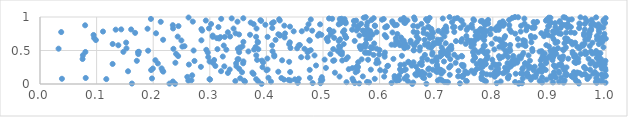
| Category | Series 0 |
|---|---|
| 0.6577083570650133 | 0.001 |
| 0.39151467776081844 | 0.002 |
| 0.2386600297569495 | 0.003 |
| 0.6826755683995668 | 0.004 |
| 0.8457954785515889 | 0.005 |
| 0.2287082657441678 | 0.006 |
| 0.16236882179334797 | 0.007 |
| 0.9519847769633453 | 0.008 |
| 0.5640135943199389 | 0.009 |
| 0.7418731885043104 | 0.01 |
| 0.851582818926593 | 0.011 |
| 0.49557412353310665 | 0.012 |
| 0.8068430579411486 | 0.013 |
| 0.48177118131768154 | 0.014 |
| 0.5561145821895631 | 0.015 |
| 0.8469149293773862 | 0.016 |
| 0.6211795006071772 | 0.017 |
| 0.45537482640513244 | 0.018 |
| 0.9836680588862309 | 0.019 |
| 0.9990413690955496 | 0.02 |
| 0.9251124557077337 | 0.021 |
| 0.6593749245634024 | 0.022 |
| 0.8871500666999539 | 0.023 |
| 0.9063073288141514 | 0.024 |
| 0.5813916187208675 | 0.025 |
| 0.7207976505275142 | 0.026 |
| 0.5415255045620846 | 0.027 |
| 0.7177577805560684 | 0.028 |
| 0.7145636042582806 | 0.029 |
| 0.8394922497313358 | 0.03 |
| 0.5778385505120144 | 0.031 |
| 0.9820733071431067 | 0.032 |
| 0.9508096456711917 | 0.033 |
| 0.9171239651383337 | 0.034 |
| 0.40808122585249396 | 0.035 |
| 0.36213586674434134 | 0.036 |
| 0.23477400931054074 | 0.037 |
| 0.8139451524758927 | 0.038 |
| 0.99214532719401 | 0.039 |
| 0.7879166648753583 | 0.04 |
| 0.7539526571633247 | 0.041 |
| 0.3853332377712915 | 0.042 |
| 0.6500414312973579 | 0.043 |
| 0.3451083058914506 | 0.044 |
| 0.7529277406694985 | 0.045 |
| 0.8828807820984435 | 0.046 |
| 0.9471541554460889 | 0.047 |
| 0.5537045803441951 | 0.048 |
| 0.3605155978847313 | 0.049 |
| 0.6299598114713447 | 0.05 |
| 0.2620503791006398 | 0.051 |
| 0.4424128741288158 | 0.052 |
| 0.7028731180280472 | 0.053 |
| 0.9268930805293935 | 0.054 |
| 0.2675133716113726 | 0.055 |
| 0.7845113333371354 | 0.056 |
| 0.7099797373108472 | 0.057 |
| 0.9856078460612595 | 0.058 |
| 0.6342726890529243 | 0.059 |
| 0.49871676101204027 | 0.06 |
| 0.4391982772350297 | 0.061 |
| 0.6331198841666579 | 0.062 |
| 0.629316671268603 | 0.063 |
| 0.8672964560582284 | 0.064 |
| 0.8947409637129079 | 0.065 |
| 0.4309683726538662 | 0.066 |
| 0.3004179498074734 | 0.067 |
| 0.49615164181225024 | 0.068 |
| 0.450201690080805 | 0.069 |
| 0.7063517004028819 | 0.07 |
| 0.29949672971371233 | 0.071 |
| 0.3819771204199189 | 0.072 |
| 0.11713722328268089 | 0.073 |
| 0.7802210960102282 | 0.074 |
| 0.9671966619125858 | 0.075 |
| 0.9453440984648958 | 0.076 |
| 0.5914186856058925 | 0.077 |
| 0.038750803568163746 | 0.078 |
| 0.4571645260793978 | 0.079 |
| 0.5520246286552065 | 0.08 |
| 0.6438503347835421 | 0.081 |
| 0.8529392517900825 | 0.082 |
| 0.19782915792301503 | 0.083 |
| 0.8270746624480898 | 0.084 |
| 0.3536465315941008 | 0.085 |
| 0.6267763652676756 | 0.086 |
| 0.9828803999318404 | 0.087 |
| 0.6787240509189165 | 0.088 |
| 0.4265040333867852 | 0.089 |
| 0.08074794796422166 | 0.09 |
| 0.47696343134294916 | 0.091 |
| 0.9026921890047329 | 0.092 |
| 0.40362800577840163 | 0.093 |
| 0.9940838118747835 | 0.094 |
| 0.9210412176052543 | 0.095 |
| 0.9114651714350256 | 0.096 |
| 0.6764509740033988 | 0.097 |
| 0.8670532464429793 | 0.098 |
| 0.8871264021701253 | 0.099 |
| 0.8265549469152792 | 0.1 |
| 0.9413291809039275 | 0.101 |
| 0.4979314990121132 | 0.102 |
| 0.779911292746229 | 0.103 |
| 0.7467088794043432 | 0.104 |
| 0.875580064573624 | 0.105 |
| 0.2602449129069175 | 0.106 |
| 0.8716659403634651 | 0.107 |
| 0.9705986389567803 | 0.108 |
| 0.8034270642867731 | 0.109 |
| 0.6081045898464867 | 0.11 |
| 0.5292177158869973 | 0.111 |
| 0.8610667700994865 | 0.112 |
| 0.570317939156256 | 0.113 |
| 0.7387538771129664 | 0.114 |
| 0.9022847526282444 | 0.115 |
| 0.9056533569579188 | 0.116 |
| 0.6481718450617242 | 0.117 |
| 0.6264341926432238 | 0.118 |
| 0.7457370913616966 | 0.119 |
| 0.9996772720182017 | 0.12 |
| 0.996066622944285 | 0.121 |
| 0.9381952996641326 | 0.122 |
| 0.6343679803991165 | 0.123 |
| 0.8287116963704869 | 0.124 |
| 0.862253362029271 | 0.125 |
| 0.9446554311487617 | 0.126 |
| 0.8018425254106775 | 0.127 |
| 0.9297263246317929 | 0.128 |
| 0.6649322240941544 | 0.129 |
| 0.2688804544058041 | 0.13 |
| 0.9448766851282245 | 0.131 |
| 0.6882368887264289 | 0.132 |
| 0.9083437074204997 | 0.133 |
| 0.7485366730861572 | 0.134 |
| 0.9988198791160979 | 0.135 |
| 0.9644971259915626 | 0.136 |
| 0.7240018832920028 | 0.137 |
| 0.9571539463283238 | 0.138 |
| 0.7958533742195025 | 0.139 |
| 0.9852380578382361 | 0.14 |
| 0.6709536948089148 | 0.141 |
| 0.9278910818003356 | 0.142 |
| 0.9927357561898761 | 0.143 |
| 0.7892229739080111 | 0.144 |
| 0.8768610138235257 | 0.145 |
| 0.8075341251197174 | 0.146 |
| 0.6631028219377458 | 0.147 |
| 0.9621686587761049 | 0.148 |
| 0.8537143946168744 | 0.149 |
| 0.37730937096602263 | 0.15 |
| 0.860864597074778 | 0.151 |
| 0.9302127186527567 | 0.152 |
| 0.8405176896992061 | 0.153 |
| 0.7091751916923033 | 0.154 |
| 0.9774301431193226 | 0.155 |
| 0.6796928206342037 | 0.156 |
| 0.8496831812067541 | 0.157 |
| 0.781124782894523 | 0.158 |
| 0.6682763406079744 | 0.159 |
| 0.8182019560814636 | 0.16 |
| 0.7670253694755241 | 0.161 |
| 0.7557072146852332 | 0.162 |
| 0.9531790667965273 | 0.163 |
| 0.8605066511310083 | 0.164 |
| 0.33198963868101594 | 0.165 |
| 0.8032189778827185 | 0.166 |
| 0.917103021457982 | 0.167 |
| 0.7822130642946176 | 0.168 |
| 0.5210201312495519 | 0.169 |
| 0.37523900902222235 | 0.17 |
| 0.810483099812357 | 0.171 |
| 0.9492616207428103 | 0.172 |
| 0.9079899631916202 | 0.173 |
| 0.8211517705831013 | 0.174 |
| 0.5578245417096903 | 0.175 |
| 0.3569269350495314 | 0.176 |
| 0.9433454175202712 | 0.177 |
| 0.9803961997911148 | 0.178 |
| 0.44199627455591234 | 0.179 |
| 0.6750683892978181 | 0.18 |
| 0.7020107063718685 | 0.181 |
| 0.8864604385064213 | 0.182 |
| 0.42099164037477577 | 0.183 |
| 0.7003331056945983 | 0.184 |
| 0.2177730329665049 | 0.185 |
| 0.6380112134499992 | 0.186 |
| 0.7126390002892306 | 0.187 |
| 0.9163060695911915 | 0.188 |
| 0.7513895203198006 | 0.189 |
| 0.15554190842411894 | 0.19 |
| 0.3198950565389479 | 0.191 |
| 0.6098231141423897 | 0.192 |
| 0.8806761102341628 | 0.193 |
| 0.7682967042965304 | 0.194 |
| 0.5608866731293695 | 0.195 |
| 0.739320295229317 | 0.196 |
| 0.8254001345980083 | 0.197 |
| 0.8052849920723678 | 0.198 |
| 0.7625812123798018 | 0.199 |
| 0.9269635671594636 | 0.2 |
| 0.2164493206824381 | 0.201 |
| 0.6678813140025208 | 0.202 |
| 0.8721599751680055 | 0.203 |
| 0.999058729952582 | 0.204 |
| 0.400158379810809 | 0.205 |
| 0.6010901947703361 | 0.206 |
| 0.6436460375917337 | 0.207 |
| 0.19634892737915602 | 0.208 |
| 0.8935471744197215 | 0.209 |
| 0.7084628026256693 | 0.21 |
| 0.4765556149039468 | 0.211 |
| 0.971958984966481 | 0.212 |
| 0.6937741656090826 | 0.213 |
| 0.5845388667546938 | 0.214 |
| 0.40213412681484595 | 0.215 |
| 0.33513317331080006 | 0.216 |
| 0.6462055282701445 | 0.217 |
| 0.8839846350835572 | 0.218 |
| 0.7016019881656144 | 0.219 |
| 0.6360125318696939 | 0.22 |
| 0.5455304864016943 | 0.221 |
| 0.6860523502665048 | 0.222 |
| 0.7048070501618386 | 0.223 |
| 0.8522018341928514 | 0.224 |
| 0.771760104609657 | 0.225 |
| 0.35193806447633225 | 0.226 |
| 0.8096054049515441 | 0.227 |
| 0.9641611233884227 | 0.228 |
| 0.9247100479744463 | 0.229 |
| 0.9925757030650876 | 0.23 |
| 0.19938320530953418 | 0.231 |
| 0.6872055346039667 | 0.232 |
| 0.21481902498539004 | 0.233 |
| 0.8638205016694955 | 0.234 |
| 0.870497321401085 | 0.235 |
| 0.9985737729001587 | 0.236 |
| 0.778044732452363 | 0.237 |
| 0.5521045853131289 | 0.238 |
| 0.8274155536697186 | 0.239 |
| 0.5051417711157264 | 0.24 |
| 0.8891315899760304 | 0.241 |
| 0.8536729215651855 | 0.242 |
| 0.9618685574114456 | 0.243 |
| 0.5590121967509705 | 0.244 |
| 0.8216339701234112 | 0.245 |
| 0.7228292085825004 | 0.246 |
| 0.797077968444053 | 0.247 |
| 0.9303365081317416 | 0.248 |
| 0.9108782712665285 | 0.249 |
| 0.5592179381782425 | 0.25 |
| 0.3931351790782917 | 0.251 |
| 0.561900384020947 | 0.252 |
| 0.8662232659876546 | 0.253 |
| 0.9613381688082375 | 0.254 |
| 0.9941274407689255 | 0.255 |
| 0.28427363931467636 | 0.256 |
| 0.7820976186028381 | 0.257 |
| 0.8740571310046206 | 0.258 |
| 0.7479462441108682 | 0.259 |
| 0.6644511412108369 | 0.26 |
| 0.9935428409897687 | 0.261 |
| 0.8317788688700818 | 0.262 |
| 0.3256396720603582 | 0.263 |
| 0.5605367716208516 | 0.264 |
| 0.34701077591266927 | 0.265 |
| 0.6136721717623402 | 0.266 |
| 0.92237459635686 | 0.267 |
| 0.701024389892262 | 0.268 |
| 0.30986932252999383 | 0.269 |
| 0.8866599499655753 | 0.27 |
| 0.9814294766682679 | 0.271 |
| 0.6148510940494463 | 0.272 |
| 0.7255995427913391 | 0.273 |
| 0.656801884654705 | 0.274 |
| 0.8622198027536484 | 0.275 |
| 0.48771492198606353 | 0.276 |
| 0.981541578685113 | 0.277 |
| 0.805466507598583 | 0.278 |
| 0.9077929811588973 | 0.279 |
| 0.748249578941867 | 0.28 |
| 0.8329934080863436 | 0.281 |
| 0.9163102374506291 | 0.282 |
| 0.8850551083175209 | 0.283 |
| 0.6745417836742715 | 0.284 |
| 0.7451914407853223 | 0.285 |
| 0.6367026519544823 | 0.286 |
| 0.8048871308604165 | 0.287 |
| 0.7013580256882297 | 0.288 |
| 0.9876817395391402 | 0.289 |
| 0.26304034835884615 | 0.29 |
| 0.6436202595216646 | 0.291 |
| 0.8107381664936346 | 0.292 |
| 0.9816854307953297 | 0.293 |
| 0.7871927501100399 | 0.294 |
| 0.8606064684122119 | 0.295 |
| 0.997733148333387 | 0.296 |
| 0.7778066783295803 | 0.297 |
| 0.7715927085208075 | 0.298 |
| 0.1282771671416405 | 0.299 |
| 0.9202362290080235 | 0.3 |
| 0.7875107603162044 | 0.301 |
| 0.8380464894703011 | 0.302 |
| 0.8012150453112378 | 0.303 |
| 0.9725708453560146 | 0.304 |
| 0.6712166658030171 | 0.305 |
| 0.8572975585090574 | 0.306 |
| 0.2082269748284445 | 0.307 |
| 0.346500329155647 | 0.308 |
| 0.3588762721068494 | 0.309 |
| 0.8569648983089942 | 0.31 |
| 0.5941522422889491 | 0.311 |
| 0.8260001452947424 | 0.312 |
| 0.8941332498463119 | 0.313 |
| 0.9469095877458386 | 0.314 |
| 0.30558154740317817 | 0.315 |
| 0.734313569348736 | 0.316 |
| 0.23919019268158676 | 0.317 |
| 0.9906885313232675 | 0.318 |
| 0.8431684165319419 | 0.319 |
| 0.5979850775680257 | 0.32 |
| 0.39438712188341657 | 0.321 |
| 0.6518205388248193 | 0.322 |
| 0.9903456748847973 | 0.323 |
| 0.6598991103401529 | 0.324 |
| 0.5621632407152507 | 0.325 |
| 0.9442798677416717 | 0.326 |
| 0.9510863115379654 | 0.327 |
| 0.6744886401358228 | 0.328 |
| 0.9474831468341119 | 0.329 |
| 0.9755868640514735 | 0.33 |
| 0.4402254254099442 | 0.331 |
| 0.6506814891894314 | 0.332 |
| 0.7820359007906921 | 0.333 |
| 0.8936960398827158 | 0.334 |
| 0.29963467293347296 | 0.335 |
| 0.7136882458291163 | 0.336 |
| 0.3594034547516508 | 0.337 |
| 0.6929407922385831 | 0.338 |
| 0.8338393647637589 | 0.339 |
| 0.9879090969593701 | 0.34 |
| 0.8432101070315688 | 0.341 |
| 0.7007948449007674 | 0.342 |
| 0.7779437651047626 | 0.343 |
| 0.27291805594011775 | 0.344 |
| 0.9990531375427243 | 0.345 |
| 0.17107440142128974 | 0.346 |
| 0.517914770191076 | 0.347 |
| 0.8655827279948196 | 0.348 |
| 0.3921094291260162 | 0.349 |
| 0.7653347991378991 | 0.35 |
| 0.5340146945403729 | 0.351 |
| 0.8846016584351628 | 0.352 |
| 0.5199966098615573 | 0.353 |
| 0.42778180351321793 | 0.354 |
| 0.20385998265682675 | 0.355 |
| 0.9054953822954941 | 0.356 |
| 0.840599925334217 | 0.357 |
| 0.30765366687925794 | 0.358 |
| 0.5957031723982692 | 0.359 |
| 0.38356430415121207 | 0.36 |
| 0.787847637178864 | 0.361 |
| 0.579632729962697 | 0.362 |
| 0.798998337454484 | 0.363 |
| 0.5028832692537709 | 0.364 |
| 0.922479403927534 | 0.365 |
| 0.6842622554038007 | 0.366 |
| 0.8362136152234977 | 0.367 |
| 0.5683069880074592 | 0.368 |
| 0.3509672183547636 | 0.369 |
| 0.3490399243248381 | 0.37 |
| 0.5407892360308886 | 0.371 |
| 0.7248135976454921 | 0.372 |
| 0.07521415013177254 | 0.373 |
| 0.9910408486714962 | 0.374 |
| 0.6244080648920469 | 0.375 |
| 0.9692219924305884 | 0.376 |
| 0.95093590114989 | 0.377 |
| 0.9332706356923499 | 0.378 |
| 0.6996664287794904 | 0.379 |
| 0.4016871698585101 | 0.38 |
| 0.8125395471309395 | 0.381 |
| 0.8493458575335274 | 0.382 |
| 0.6755660770115658 | 0.383 |
| 0.8866849927271747 | 0.384 |
| 0.9193588386428857 | 0.385 |
| 0.7899274676313722 | 0.386 |
| 0.8890265274038649 | 0.387 |
| 0.983887251883694 | 0.388 |
| 0.7681693450203874 | 0.389 |
| 0.9052969050008275 | 0.39 |
| 0.897577876679795 | 0.391 |
| 0.9870124235695679 | 0.392 |
| 0.8909828998665 | 0.393 |
| 0.7686388451513136 | 0.394 |
| 0.7377603628992031 | 0.395 |
| 0.7011230395926239 | 0.396 |
| 0.9186957642097879 | 0.397 |
| 0.543746867481257 | 0.398 |
| 0.47271654600600166 | 0.399 |
| 0.46143707184515814 | 0.4 |
| 0.2972836110840387 | 0.401 |
| 0.8268629006919133 | 0.402 |
| 0.906734074720291 | 0.403 |
| 0.9466548849682214 | 0.404 |
| 0.8172987561354872 | 0.405 |
| 0.9437386349128967 | 0.406 |
| 0.6088980019712505 | 0.407 |
| 0.7066231359870313 | 0.408 |
| 0.8468279456927401 | 0.409 |
| 0.3229487263171297 | 0.41 |
| 0.7457965002695061 | 0.411 |
| 0.41397188469877577 | 0.412 |
| 0.790711212183882 | 0.413 |
| 0.9243538570796883 | 0.414 |
| 0.8108285129709164 | 0.415 |
| 0.9007297000194122 | 0.416 |
| 0.2441026706958165 | 0.417 |
| 0.836287938404834 | 0.418 |
| 0.7448858645795139 | 0.419 |
| 0.9070305653166639 | 0.42 |
| 0.6394442862331902 | 0.421 |
| 0.8512367982468342 | 0.422 |
| 0.88830945461054 | 0.423 |
| 0.7667572102068765 | 0.424 |
| 0.7204161959674329 | 0.425 |
| 0.4849830324315944 | 0.426 |
| 0.8631425500660771 | 0.427 |
| 0.3821124116299216 | 0.428 |
| 0.07577943617707854 | 0.429 |
| 0.9457775260148447 | 0.43 |
| 0.41384310526151996 | 0.431 |
| 0.7200882932265575 | 0.432 |
| 0.7095408346753281 | 0.433 |
| 0.6800564019658953 | 0.434 |
| 0.5892681342964827 | 0.435 |
| 0.6084165565963358 | 0.436 |
| 0.7318573194585671 | 0.437 |
| 0.6930116287873169 | 0.438 |
| 0.9865654227078883 | 0.439 |
| 0.5992264605483665 | 0.44 |
| 0.5334013359983687 | 0.441 |
| 0.8226744081022382 | 0.442 |
| 0.987197023714256 | 0.443 |
| 0.9637768030418026 | 0.444 |
| 0.9039623547996635 | 0.445 |
| 0.5131055751692323 | 0.446 |
| 0.17366356195749044 | 0.447 |
| 0.9555218516929948 | 0.448 |
| 0.2404654856377924 | 0.449 |
| 0.7869743141052153 | 0.45 |
| 0.9119851971361818 | 0.451 |
| 0.9412418012754322 | 0.452 |
| 0.9759358076742983 | 0.453 |
| 0.9095559266561223 | 0.454 |
| 0.891698378791664 | 0.455 |
| 0.5305475278728231 | 0.456 |
| 0.9653163539587605 | 0.457 |
| 0.9815887986190713 | 0.458 |
| 0.7209103472872891 | 0.459 |
| 0.9900662729521995 | 0.46 |
| 0.7130698131270208 | 0.461 |
| 0.8539926247154348 | 0.462 |
| 0.7153273291018617 | 0.463 |
| 0.5817324895714243 | 0.464 |
| 0.9856627869018453 | 0.465 |
| 0.5775095594904428 | 0.466 |
| 0.5740996056504898 | 0.467 |
| 0.6934679105438114 | 0.468 |
| 0.29638567322038345 | 0.469 |
| 0.6093115138977415 | 0.47 |
| 0.4727086935497349 | 0.471 |
| 0.774685413906346 | 0.472 |
| 0.7082138077618956 | 0.473 |
| 0.35186927246705707 | 0.474 |
| 0.7650374882958014 | 0.475 |
| 0.5333906940224964 | 0.476 |
| 0.17325830153091065 | 0.477 |
| 0.08020122178426367 | 0.478 |
| 0.9408868114809649 | 0.479 |
| 0.14732556763308874 | 0.48 |
| 0.17471482378228478 | 0.481 |
| 0.7831365279476716 | 0.482 |
| 0.7908380847996835 | 0.483 |
| 0.8825083281550932 | 0.484 |
| 0.963332434980265 | 0.485 |
| 0.3682149868126206 | 0.486 |
| 0.8282503413724855 | 0.487 |
| 0.9731704750765201 | 0.488 |
| 0.41087829509636575 | 0.489 |
| 0.8701840003975232 | 0.49 |
| 0.8861587668955553 | 0.491 |
| 0.9825265905778138 | 0.492 |
| 0.4745473602383335 | 0.493 |
| 0.5259614677373474 | 0.494 |
| 0.8308155084093148 | 0.495 |
| 0.9018884506919546 | 0.496 |
| 0.19098372075108846 | 0.497 |
| 0.8220967176911922 | 0.498 |
| 0.7124148796424742 | 0.499 |
| 0.27138867480955753 | 0.5 |
| 0.6707402328341937 | 0.501 |
| 0.6600928112899063 | 0.502 |
| 0.7803858563160188 | 0.503 |
| 0.9105535882804697 | 0.504 |
| 0.4782995189538556 | 0.505 |
| 0.660712509034791 | 0.506 |
| 0.9252505343906909 | 0.507 |
| 0.599765958095443 | 0.508 |
| 0.7680966161523822 | 0.509 |
| 0.29383336281601263 | 0.51 |
| 0.9238220131959185 | 0.511 |
| 0.32921080385855345 | 0.512 |
| 0.782421377927381 | 0.513 |
| 0.378302670270789 | 0.514 |
| 0.7213284495404038 | 0.515 |
| 0.8027652051799414 | 0.516 |
| 0.7261878965413153 | 0.517 |
| 0.9075858740543941 | 0.518 |
| 0.3856926046222784 | 0.519 |
| 0.3135105315553586 | 0.52 |
| 0.5181338905341402 | 0.521 |
| 0.5668716035684148 | 0.522 |
| 0.8696854271399572 | 0.523 |
| 0.3495691706916779 | 0.524 |
| 0.23573795463955247 | 0.525 |
| 0.46730463171622816 | 0.526 |
| 0.03282053018698447 | 0.527 |
| 0.5945482037472352 | 0.528 |
| 0.8297205836143113 | 0.529 |
| 0.7267747688073839 | 0.53 |
| 0.95293406420859 | 0.531 |
| 0.15277239450538233 | 0.532 |
| 0.454319062885404 | 0.533 |
| 0.6439371849949573 | 0.534 |
| 0.9150803313639887 | 0.535 |
| 0.35344094998078734 | 0.536 |
| 0.5857413104183384 | 0.537 |
| 0.4425148685838903 | 0.538 |
| 0.5875698416972611 | 0.539 |
| 0.7243434798206667 | 0.54 |
| 0.69091940129935 | 0.541 |
| 0.8172600159007605 | 0.542 |
| 0.5656619879522413 | 0.543 |
| 0.35244896305591006 | 0.544 |
| 0.9291516479897746 | 0.545 |
| 0.7098263056790803 | 0.546 |
| 0.6714426368718556 | 0.547 |
| 0.9955060930178001 | 0.548 |
| 0.5840716944424069 | 0.549 |
| 0.5302789498731637 | 0.55 |
| 0.6494572711802342 | 0.551 |
| 0.3809315349089193 | 0.552 |
| 0.5748180836546675 | 0.553 |
| 0.6863088930969851 | 0.554 |
| 0.811590173366919 | 0.555 |
| 0.9491973341387585 | 0.556 |
| 0.7620877248755112 | 0.557 |
| 0.25150905636967785 | 0.558 |
| 0.8993487832751401 | 0.559 |
| 0.6424983219423185 | 0.56 |
| 0.35764246849468084 | 0.561 |
| 0.5283061828572276 | 0.562 |
| 0.5692931402486832 | 0.563 |
| 0.2552949743442878 | 0.564 |
| 0.5650082236837085 | 0.565 |
| 0.9714152614441296 | 0.566 |
| 0.8578318881518527 | 0.567 |
| 0.7839212864680043 | 0.568 |
| 0.9575099897992191 | 0.569 |
| 0.726445060247462 | 0.57 |
| 0.7858640906118749 | 0.571 |
| 0.6614853009769728 | 0.572 |
| 0.9597715062216847 | 0.573 |
| 0.32464592723091773 | 0.574 |
| 0.456911053671327 | 0.575 |
| 0.8453072756471204 | 0.576 |
| 0.4100990680190944 | 0.577 |
| 0.13840317066450405 | 0.578 |
| 0.6359002740385516 | 0.579 |
| 0.8945311213303818 | 0.58 |
| 0.694896614305792 | 0.581 |
| 0.4590332173849512 | 0.582 |
| 0.8306755524968947 | 0.583 |
| 0.6268587557591199 | 0.584 |
| 0.6611697742590317 | 0.585 |
| 0.8217589183523646 | 0.586 |
| 0.6211842784138157 | 0.587 |
| 0.6799678893235909 | 0.588 |
| 0.7663392544580816 | 0.589 |
| 0.8527525434472807 | 0.59 |
| 0.958313383279221 | 0.591 |
| 0.9406476483225081 | 0.592 |
| 0.5750862934431347 | 0.593 |
| 0.44019230670275383 | 0.594 |
| 0.9874977979486912 | 0.595 |
| 0.5365566050499366 | 0.596 |
| 0.12839460355324306 | 0.597 |
| 0.645241797591955 | 0.598 |
| 0.7520466336331394 | 0.599 |
| 0.6859426601747348 | 0.6 |
| 0.7980711299204163 | 0.601 |
| 0.962191480667756 | 0.602 |
| 0.5758407309367498 | 0.603 |
| 0.6425197875211734 | 0.604 |
| 0.5904327058233632 | 0.605 |
| 0.7616154191388795 | 0.606 |
| 0.9265880684058347 | 0.607 |
| 0.7167438703398298 | 0.608 |
| 0.7051015208382423 | 0.609 |
| 0.817233005414383 | 0.61 |
| 0.700440574725699 | 0.611 |
| 0.8565274684111308 | 0.612 |
| 0.6954759659236557 | 0.613 |
| 0.9107668061673878 | 0.614 |
| 0.9760569711619197 | 0.615 |
| 0.9455279111181603 | 0.616 |
| 0.6547941023972005 | 0.617 |
| 0.15219272022250913 | 0.618 |
| 0.9925778561449329 | 0.619 |
| 0.38490198554523536 | 0.62 |
| 0.7647797382491859 | 0.621 |
| 0.44142224990424117 | 0.622 |
| 0.8680926369017041 | 0.623 |
| 0.6656670798635215 | 0.624 |
| 0.9391356693098653 | 0.625 |
| 0.632450974696084 | 0.626 |
| 0.9904658919007266 | 0.627 |
| 0.9143350007638213 | 0.628 |
| 0.3593225126334929 | 0.629 |
| 0.7618379191991417 | 0.63 |
| 0.3845902869255428 | 0.631 |
| 0.9291835831545766 | 0.632 |
| 0.9365463942249453 | 0.633 |
| 0.7437729507910189 | 0.634 |
| 0.8149413586924416 | 0.635 |
| 0.993875232900593 | 0.636 |
| 0.6292109997070527 | 0.637 |
| 0.7664684199849229 | 0.638 |
| 0.5085462284816705 | 0.639 |
| 0.7348876516950577 | 0.64 |
| 0.7670518671141837 | 0.641 |
| 0.527858451302694 | 0.642 |
| 0.5560093394301157 | 0.643 |
| 0.8566085202026945 | 0.644 |
| 0.7617146057119305 | 0.645 |
| 0.6548334435534028 | 0.646 |
| 0.47667173520085054 | 0.647 |
| 0.6427052233774249 | 0.648 |
| 0.9301279641449641 | 0.649 |
| 0.24978624526787022 | 0.65 |
| 0.6402517680934464 | 0.651 |
| 0.28514249059927516 | 0.652 |
| 0.8538203223911689 | 0.653 |
| 0.47582741147683594 | 0.654 |
| 0.7847572142783408 | 0.655 |
| 0.09872956251985822 | 0.656 |
| 0.7559754218160292 | 0.657 |
| 0.4161664218666629 | 0.658 |
| 0.6795011488209682 | 0.659 |
| 0.21751494391116646 | 0.66 |
| 0.7082907128636684 | 0.661 |
| 0.7026437082286688 | 0.662 |
| 0.963453960742844 | 0.663 |
| 0.8111782482960774 | 0.664 |
| 0.9840778152618671 | 0.665 |
| 0.9683915876431526 | 0.666 |
| 0.5766329407564473 | 0.667 |
| 0.5303253208570855 | 0.668 |
| 0.7456169155028152 | 0.669 |
| 0.9074143182325519 | 0.67 |
| 0.66906548622915 | 0.671 |
| 0.8443483414615115 | 0.672 |
| 0.5064806985281974 | 0.673 |
| 0.9316943721723522 | 0.674 |
| 0.8053333406540146 | 0.675 |
| 0.9996635742441966 | 0.676 |
| 0.7729394279410877 | 0.677 |
| 0.9286191783972471 | 0.678 |
| 0.31651856630121333 | 0.679 |
| 0.9280053719536923 | 0.68 |
| 0.582930242306048 | 0.681 |
| 0.7727616169570134 | 0.682 |
| 0.6286885209092575 | 0.683 |
| 0.3126462376744147 | 0.684 |
| 0.09574139307451805 | 0.685 |
| 0.68877547812065 | 0.686 |
| 0.8202227716623748 | 0.687 |
| 0.5197515329687095 | 0.688 |
| 0.5080175554571611 | 0.689 |
| 0.5405063064844989 | 0.69 |
| 0.8680346099579841 | 0.691 |
| 0.9899504670311016 | 0.692 |
| 0.5409302103638924 | 0.693 |
| 0.6379107160187062 | 0.694 |
| 0.43213767542198633 | 0.695 |
| 0.7797654050401779 | 0.696 |
| 0.6935453653471951 | 0.697 |
| 0.6119789833616323 | 0.698 |
| 0.874342073448073 | 0.699 |
| 0.3187000199541166 | 0.7 |
| 0.995584202144808 | 0.701 |
| 0.3263918052143743 | 0.702 |
| 0.4020651001442789 | 0.703 |
| 0.38182039855066585 | 0.704 |
| 0.30520573187113653 | 0.705 |
| 0.9700462283355036 | 0.706 |
| 0.2432849876451666 | 0.707 |
| 0.9963260586279248 | 0.708 |
| 0.3359533608991469 | 0.709 |
| 0.7144488193981017 | 0.71 |
| 0.9048531307463858 | 0.711 |
| 0.6654795246658343 | 0.712 |
| 0.8905404423123009 | 0.713 |
| 0.821735309763134 | 0.714 |
| 0.9838463762783105 | 0.715 |
| 0.7533062202943027 | 0.716 |
| 0.8673762248802473 | 0.717 |
| 0.7857577293285122 | 0.718 |
| 0.7722738018171281 | 0.719 |
| 0.7694170386222453 | 0.72 |
| 0.49101963586456665 | 0.721 |
| 0.6907308798180699 | 0.722 |
| 0.3051817290818701 | 0.723 |
| 0.5644875792709961 | 0.724 |
| 0.4236231976736786 | 0.725 |
| 0.9611397804459807 | 0.726 |
| 0.4240920463186683 | 0.727 |
| 0.5387015670443956 | 0.728 |
| 0.8981645592265775 | 0.729 |
| 0.6091047722928253 | 0.73 |
| 0.7743803144658793 | 0.731 |
| 0.09462203814909481 | 0.732 |
| 0.5786550084755007 | 0.733 |
| 0.49720444336550035 | 0.734 |
| 0.3711005121155255 | 0.735 |
| 0.5135843597550791 | 0.736 |
| 0.5875526417031182 | 0.737 |
| 0.573068045324504 | 0.738 |
| 0.3516938301721691 | 0.739 |
| 0.8909452255770947 | 0.74 |
| 0.6839377106717913 | 0.741 |
| 0.42103955593481973 | 0.742 |
| 0.795697708027507 | 0.743 |
| 0.9709264017711305 | 0.744 |
| 0.970406597877878 | 0.745 |
| 0.6314269744828352 | 0.746 |
| 0.9970598522238369 | 0.747 |
| 0.7848443461348786 | 0.748 |
| 0.9204092593743883 | 0.749 |
| 0.4934953671692885 | 0.75 |
| 0.8395751736002988 | 0.751 |
| 0.9609271231416782 | 0.752 |
| 0.5847626057987861 | 0.753 |
| 0.9169257664845407 | 0.754 |
| 0.4330188403701941 | 0.755 |
| 0.3454509193154608 | 0.756 |
| 0.20500952666250405 | 0.757 |
| 0.7104321831389109 | 0.758 |
| 0.8857210386730423 | 0.759 |
| 0.9701136857023253 | 0.76 |
| 0.6943010190275194 | 0.761 |
| 0.9446228030078476 | 0.762 |
| 0.16809275374863483 | 0.763 |
| 0.6774659256991016 | 0.764 |
| 0.5757543514608756 | 0.765 |
| 0.9296344696579399 | 0.766 |
| 0.9101507730109106 | 0.767 |
| 0.6662135702653089 | 0.768 |
| 0.6227467965779695 | 0.769 |
| 0.9879620348086634 | 0.77 |
| 0.9378573663327192 | 0.771 |
| 0.33188374178249685 | 0.772 |
| 0.5947588189470415 | 0.773 |
| 0.781459196949566 | 0.774 |
| 0.037488620624532266 | 0.775 |
| 0.5353541512820101 | 0.776 |
| 0.7318811668896378 | 0.777 |
| 0.6601487059581802 | 0.778 |
| 0.8324072446656654 | 0.779 |
| 0.7181481851233545 | 0.78 |
| 0.7699433735518478 | 0.781 |
| 0.8492138051059588 | 0.782 |
| 0.11130695411511492 | 0.783 |
| 0.5185117471214558 | 0.784 |
| 0.9061575451786371 | 0.785 |
| 0.44821883855809136 | 0.786 |
| 0.46252304408584344 | 0.787 |
| 0.6922719051033687 | 0.788 |
| 0.5835422489180128 | 0.789 |
| 0.7893258591758676 | 0.79 |
| 0.5716643602417009 | 0.791 |
| 0.7752704418051826 | 0.792 |
| 0.7038154596055556 | 0.793 |
| 0.9717760763447332 | 0.794 |
| 0.8954451200409002 | 0.795 |
| 0.4809123445335681 | 0.796 |
| 0.2866225828168403 | 0.797 |
| 0.5704039278306543 | 0.798 |
| 0.5592034407490369 | 0.799 |
| 0.987408728743207 | 0.8 |
| 0.8591453050798046 | 0.801 |
| 0.5376030442252984 | 0.802 |
| 0.5117305204561533 | 0.803 |
| 0.9737713241345215 | 0.804 |
| 0.913178767591499 | 0.805 |
| 0.8055999280166843 | 0.806 |
| 0.7538889561031192 | 0.807 |
| 0.5115190978676125 | 0.808 |
| 0.8103246395353136 | 0.809 |
| 0.5514467365963008 | 0.81 |
| 0.13374928127277985 | 0.811 |
| 0.7135509593575721 | 0.812 |
| 0.9625969005400908 | 0.813 |
| 0.16107372130310016 | 0.814 |
| 0.143518796046101 | 0.815 |
| 0.8295725430448726 | 0.816 |
| 0.7833425016302066 | 0.817 |
| 0.5785542877405717 | 0.818 |
| 0.2851543236321935 | 0.819 |
| 0.6780986863660287 | 0.82 |
| 0.7966816857110263 | 0.821 |
| 0.6914142249118035 | 0.822 |
| 0.9738435260534702 | 0.823 |
| 0.7784940003012695 | 0.824 |
| 0.18999953677030398 | 0.825 |
| 0.47110035851618104 | 0.826 |
| 0.3419488183899756 | 0.827 |
| 0.3825512028158792 | 0.828 |
| 0.23515861708033373 | 0.829 |
| 0.2984789099006336 | 0.83 |
| 0.7177661328348391 | 0.831 |
| 0.5621523192947628 | 0.832 |
| 0.8053248153159134 | 0.833 |
| 0.9525266431724044 | 0.834 |
| 0.41038049147710987 | 0.835 |
| 0.9198628297345969 | 0.836 |
| 0.8732503182932252 | 0.837 |
| 0.7430230439609782 | 0.838 |
| 0.8693153857692523 | 0.839 |
| 0.7636516681790358 | 0.84 |
| 0.9949680535561487 | 0.841 |
| 0.7563831033653879 | 0.842 |
| 0.6878215274092088 | 0.843 |
| 0.932129589852735 | 0.844 |
| 0.8601058323198338 | 0.845 |
| 0.609826604033903 | 0.846 |
| 0.7297214218635449 | 0.847 |
| 0.873738503581223 | 0.848 |
| 0.9106462996692137 | 0.849 |
| 0.31526968320032583 | 0.85 |
| 0.9379147736718426 | 0.851 |
| 0.7322072708236638 | 0.852 |
| 0.6123096602769976 | 0.853 |
| 0.6857188470260481 | 0.854 |
| 0.8619159283794791 | 0.855 |
| 0.44166760771732533 | 0.856 |
| 0.9851391764655427 | 0.857 |
| 0.9905286541868129 | 0.858 |
| 0.6671940111144055 | 0.859 |
| 0.7169385192889564 | 0.86 |
| 0.8977905760611637 | 0.861 |
| 0.6128823759744734 | 0.862 |
| 0.8993018481152266 | 0.863 |
| 0.244670426446016 | 0.864 |
| 0.8140244269439125 | 0.865 |
| 0.5918557185970655 | 0.866 |
| 0.8093599030309919 | 0.867 |
| 0.6594977259982809 | 0.868 |
| 0.8499825236382922 | 0.869 |
| 0.8184319859082866 | 0.87 |
| 0.4316788099764771 | 0.871 |
| 0.5915154949043548 | 0.872 |
| 0.5632128226354185 | 0.873 |
| 0.5770813352200335 | 0.874 |
| 0.5552426310188496 | 0.875 |
| 0.07972771283644536 | 0.876 |
| 0.6267494360581463 | 0.877 |
| 0.23464892206733018 | 0.878 |
| 0.829100917149824 | 0.879 |
| 0.9260988272008688 | 0.88 |
| 0.7864143423154363 | 0.881 |
| 0.6303123140303133 | 0.882 |
| 0.9799297038011521 | 0.883 |
| 0.3981829214285761 | 0.884 |
| 0.9737274767495916 | 0.885 |
| 0.7628329677234567 | 0.886 |
| 0.7483041648555925 | 0.887 |
| 0.9218964187714206 | 0.888 |
| 0.5278121645129396 | 0.889 |
| 0.49487180980182616 | 0.89 |
| 0.9865464203049339 | 0.891 |
| 0.47439071115140335 | 0.892 |
| 0.9541394576972788 | 0.893 |
| 0.37751148315511224 | 0.894 |
| 0.302310681379155 | 0.895 |
| 0.9322628034495886 | 0.896 |
| 0.673891003811894 | 0.897 |
| 0.9627589541975479 | 0.898 |
| 0.5672058448497971 | 0.899 |
| 0.8204444880416699 | 0.9 |
| 0.791694080230026 | 0.901 |
| 0.8560291855293478 | 0.902 |
| 0.9529099610597275 | 0.903 |
| 0.5291330471061344 | 0.904 |
| 0.8738162557583149 | 0.905 |
| 0.5401086683787334 | 0.906 |
| 0.4099461300527303 | 0.907 |
| 0.9101091514053686 | 0.908 |
| 0.5315921525219832 | 0.909 |
| 0.9983073902390529 | 0.91 |
| 0.6451025851617781 | 0.911 |
| 0.9763123199228744 | 0.912 |
| 0.6230924281374007 | 0.913 |
| 0.8126631791199825 | 0.914 |
| 0.9030201081748398 | 0.915 |
| 0.64359806388821 | 0.916 |
| 0.3722960947814433 | 0.917 |
| 0.7829808504210445 | 0.918 |
| 0.5786851311500314 | 0.919 |
| 0.7887059840578459 | 0.92 |
| 0.7885324934727054 | 0.921 |
| 0.4129388047302612 | 0.922 |
| 0.7280074274444127 | 0.923 |
| 0.5398182007543272 | 0.924 |
| 0.8720941139625842 | 0.925 |
| 0.9180804979867548 | 0.926 |
| 0.8782530039272032 | 0.927 |
| 0.21332656948040526 | 0.928 |
| 0.8997999231473013 | 0.929 |
| 0.3489154987766843 | 0.93 |
| 0.2699829159372618 | 0.931 |
| 0.9957193151863923 | 0.932 |
| 0.5386053814176834 | 0.933 |
| 0.8176366661605775 | 0.934 |
| 0.6223510314701078 | 0.935 |
| 0.5325309575177979 | 0.936 |
| 0.7787020837137438 | 0.937 |
| 0.918337282083408 | 0.938 |
| 0.9666907251858422 | 0.939 |
| 0.6846596094854596 | 0.94 |
| 0.5545590513634214 | 0.941 |
| 0.39065623077878514 | 0.942 |
| 0.7810668150302981 | 0.943 |
| 0.7450216939363494 | 0.944 |
| 0.8938795321466095 | 0.945 |
| 0.5586391704791045 | 0.946 |
| 0.2929777422336397 | 0.947 |
| 0.4235745301773112 | 0.948 |
| 0.6491663733759074 | 0.949 |
| 0.7440552608823051 | 0.95 |
| 0.7668675033232519 | 0.951 |
| 0.38938771707711817 | 0.952 |
| 0.9955833647198434 | 0.953 |
| 0.5856212308842959 | 0.954 |
| 0.8287975065844331 | 0.955 |
| 0.7917769274889894 | 0.956 |
| 0.974761175644095 | 0.957 |
| 0.9342652662279111 | 0.958 |
| 0.604295893775294 | 0.959 |
| 0.637384140533495 | 0.96 |
| 0.6622677854173972 | 0.961 |
| 0.8956590246095256 | 0.962 |
| 0.47844375348161977 | 0.963 |
| 0.9395792056147755 | 0.964 |
| 0.7657419577664432 | 0.965 |
| 0.4225341392218828 | 0.966 |
| 0.6820863371537214 | 0.967 |
| 0.5381204351107128 | 0.968 |
| 0.5295872075533469 | 0.969 |
| 0.6072895078566993 | 0.97 |
| 0.19592842971041122 | 0.971 |
| 0.32013697502722693 | 0.972 |
| 0.5162668388346728 | 0.973 |
| 0.5328332691780082 | 0.974 |
| 0.7327052972146594 | 0.975 |
| 0.8557561281152294 | 0.976 |
| 0.71161004112326 | 0.977 |
| 0.5106116213519178 | 0.978 |
| 0.3386456964359205 | 0.979 |
| 0.9630860198139236 | 0.98 |
| 0.35923451578725557 | 0.981 |
| 0.5895752331577285 | 0.982 |
| 0.9993416722397274 | 0.983 |
| 0.7374811406152559 | 0.984 |
| 0.6428236168378807 | 0.985 |
| 0.8343813178134615 | 0.986 |
| 0.6883678899443278 | 0.987 |
| 0.9018549029515233 | 0.988 |
| 0.5719960003850046 | 0.989 |
| 0.8990286128809611 | 0.99 |
| 0.9279136030591122 | 0.991 |
| 0.26248437403124036 | 0.992 |
| 0.6608928373445742 | 0.993 |
| 0.9825171539370087 | 0.994 |
| 0.9549355360229423 | 0.995 |
| 0.8448163398222892 | 0.996 |
| 0.9250136200214715 | 0.997 |
| 0.5755306902722827 | 0.998 |
| 0.7236097525032962 | 0.999 |
| 0.8391771938378112 | 1 |